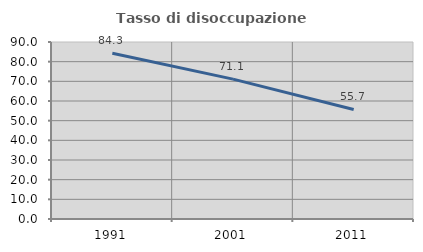
| Category | Tasso di disoccupazione giovanile  |
|---|---|
| 1991.0 | 84.285 |
| 2001.0 | 71.136 |
| 2011.0 | 55.714 |